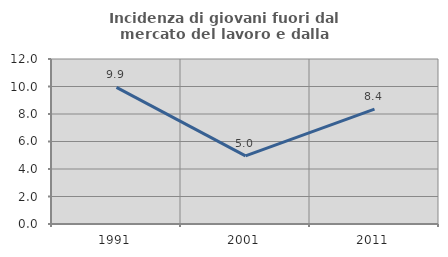
| Category | Incidenza di giovani fuori dal mercato del lavoro e dalla formazione  |
|---|---|
| 1991.0 | 9.936 |
| 2001.0 | 4.954 |
| 2011.0 | 8.359 |